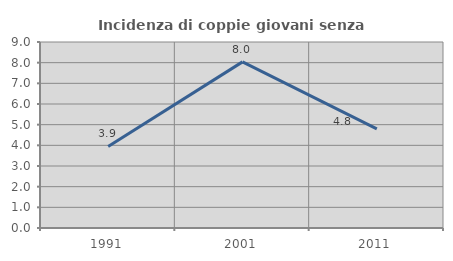
| Category | Incidenza di coppie giovani senza figli |
|---|---|
| 1991.0 | 3.945 |
| 2001.0 | 8.037 |
| 2011.0 | 4.795 |